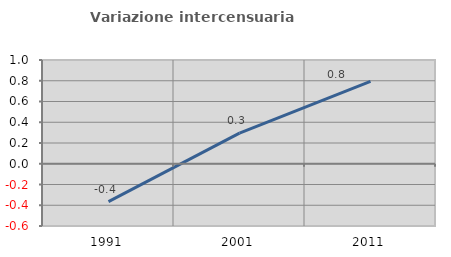
| Category | Variazione intercensuaria annua |
|---|---|
| 1991.0 | -0.364 |
| 2001.0 | 0.296 |
| 2011.0 | 0.794 |